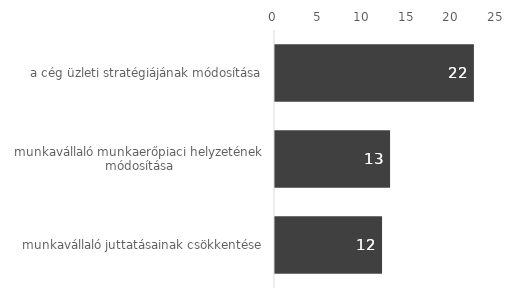
| Category | Series 0 |
|---|---|
| munkavállaló juttatásainak csökkentése | 12 |
| munkavállaló munkaerőpiaci helyzetének módosítása | 12.9 |
| a cég üzleti stratégiájának módosítása | 22.3 |